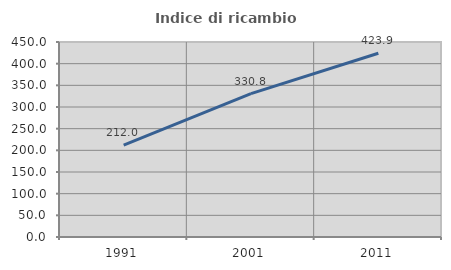
| Category | Indice di ricambio occupazionale  |
|---|---|
| 1991.0 | 212 |
| 2001.0 | 330.838 |
| 2011.0 | 423.936 |